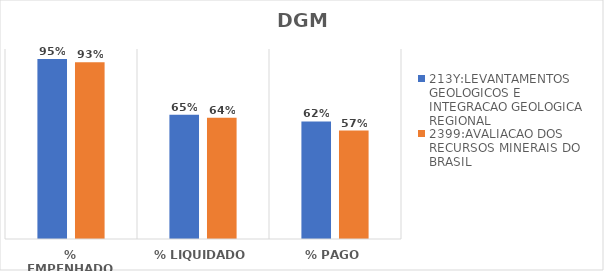
| Category | 213Y:LEVANTAMENTOS GEOLOGICOS E INTEGRACAO GEOLOGICA REGIONAL | 2399:AVALIACAO DOS RECURSOS MINERAIS DO BRASIL |
|---|---|---|
| % EMPENHADO | 0.947 | 0.93 |
| % LIQUIDADO | 0.653 | 0.638 |
| % PAGO | 0.619 | 0.571 |